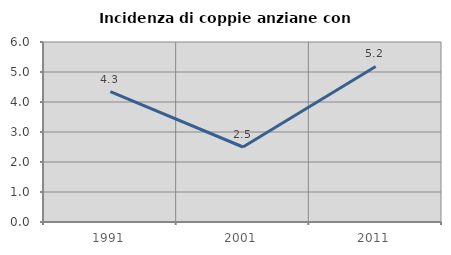
| Category | Incidenza di coppie anziane con figli |
|---|---|
| 1991.0 | 4.348 |
| 2001.0 | 2.5 |
| 2011.0 | 5.185 |